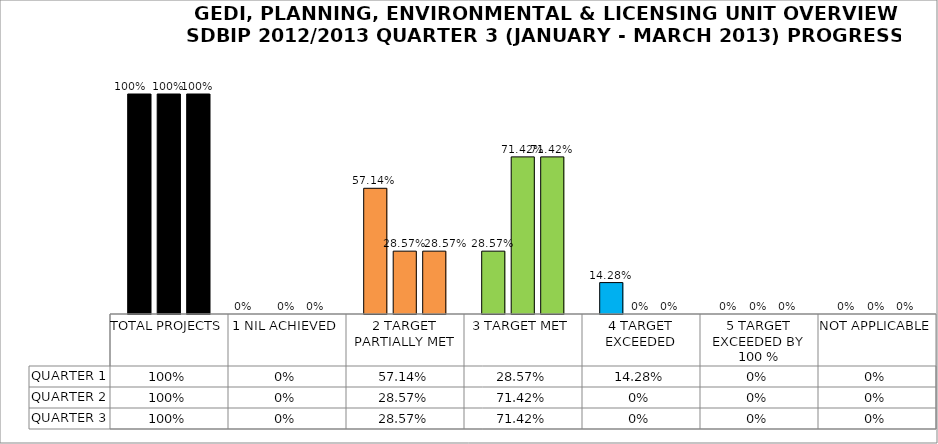
| Category | QUARTER 1 | QUARTER 2 | QUARTER 3 |
|---|---|---|---|
| TOTAL PROJECTS | 1 | 1 | 1 |
| 1 NIL ACHIEVED | 0 | 0 | 0 |
| 2 TARGET PARTIALLY MET | 0.571 | 0.286 | 0.286 |
| 3 TARGET MET | 0.286 | 0.714 | 0.714 |
| 4 TARGET EXCEEDED | 0.143 | 0 | 0 |
| 5 TARGET EXCEEDED BY 100 % | 0 | 0 | 0 |
| NOT APPLICABLE | 0 | 0 | 0 |